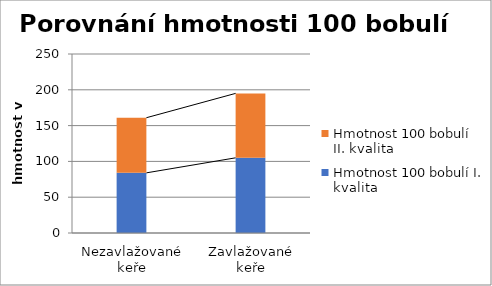
| Category | Hmotnost 100 bobulí I. kvalita | Hmotnost 100 bobulí II. kvalita |
|---|---|---|
| Nezavlažované keře | 84 | 77 |
| Zavlažované keře | 105 | 90 |